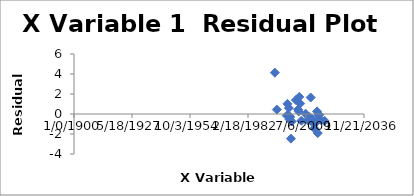
| Category | Series 0 |
|---|---|
| 43217.0 | -0.692 |
| 42531.0 | -0.585 |
| 42279.0 | -0.074 |
| 42146.0 | -0.127 |
| 42027.0 | -1.91 |
| 41908.0 | 0.261 |
| 41796.0 | -0.794 |
| 41432.0 | -1.442 |
| 41306.0 | -0.949 |
| 41033.0 | -0.48 |
| 40816.0 | 1.649 |
| 40452.0 | -0.259 |
| 40291.0 | -0.629 |
| 39933.0 | 0.031 |
| 39206.0 | -0.669 |
| 38996.0 | 1.044 |
| 38842.0 | 1.713 |
| 38751.0 | 0.253 |
| 38632.0 | 0.446 |
| 38261.0 | 1.391 |
| 37536.0 | -0.749 |
| 37403.0 | -2.468 |
| 37291.0 | -0.293 |
| 37165.0 | -0.554 |
| 37046.0 | 0.595 |
| 36927.0 | -0.136 |
| 36801.0 | 1.015 |
| 36682.0 | -0.164 |
| 34973.0 | 0.441 |
| 34639.0 | 4.134 |